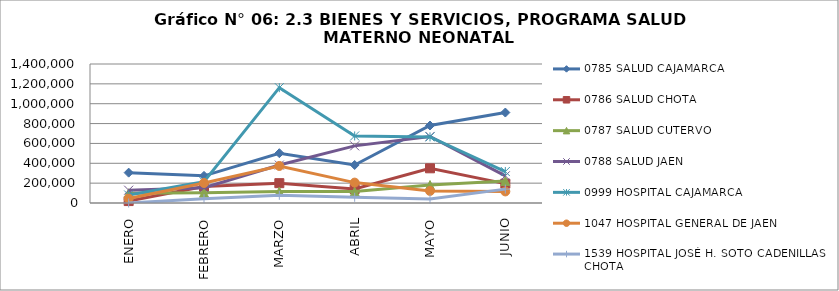
| Category | 0785 SALUD CAJAMARCA | 0786 SALUD CHOTA | 0787 SALUD CUTERVO | 0788 SALUD JAEN | 0999 HOSPITAL CAJAMARCA | 1047 HOSPITAL GENERAL DE JAEN | 1539 HOSPITAL JOSÉ H. SOTO CADENILLAS - CHOTA |
|---|---|---|---|---|---|---|---|
| ENERO | 305661 | 19359 | 98062 | 128989 | 80602 | 44718 | 0 |
| FEBRERO | 273342 | 166668 | 104121 | 153770 | 214117 | 201549 | 43695 |
| MARZO | 501648 | 199754 | 115094 | 382099 | 1161729 | 373120 | 77528 |
| ABRIL | 382995 | 141173 | 114694 | 575416 | 675319 | 205432 | 57580 |
| MAYO | 780383 | 349524 | 180877 | 670452 | 665781 | 121396 | 40985 |
| JUNIO | 911110 | 195331 | 222288 | 273901 | 316829 | 116548 | 139847 |